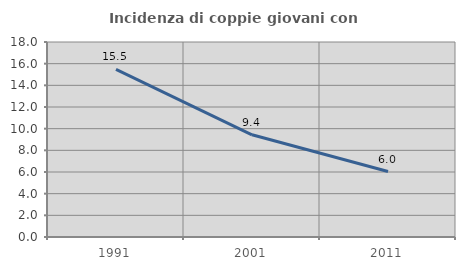
| Category | Incidenza di coppie giovani con figli |
|---|---|
| 1991.0 | 15.467 |
| 2001.0 | 9.436 |
| 2011.0 | 6.043 |